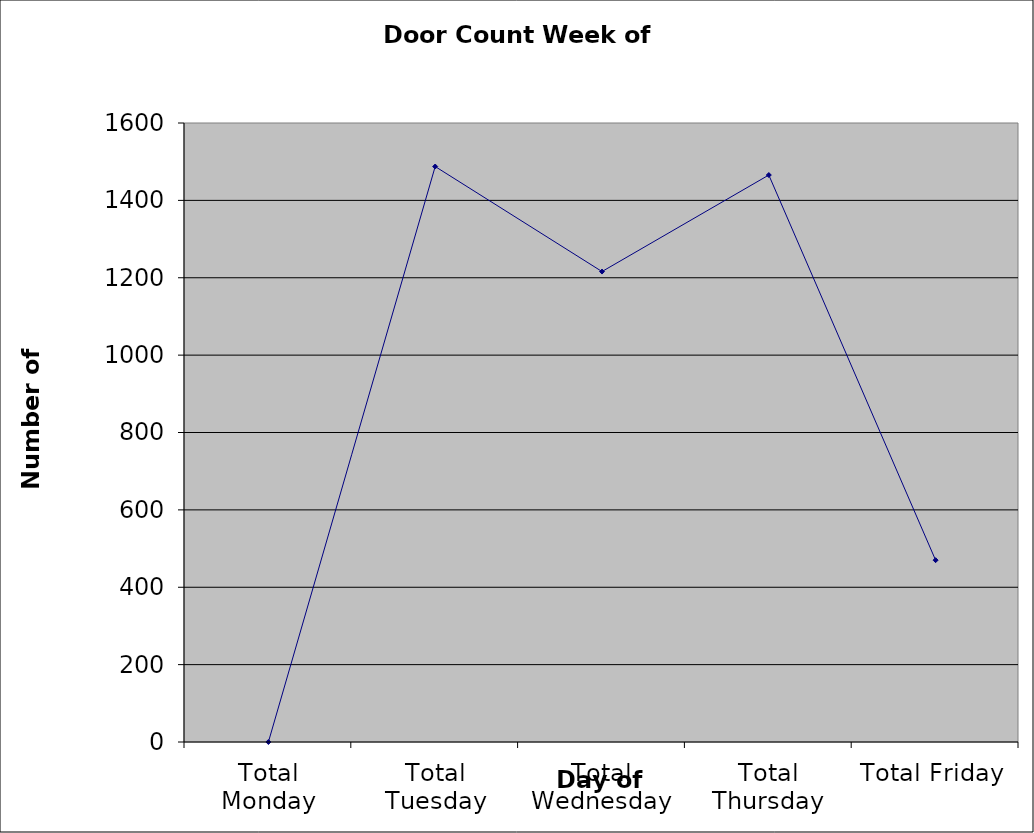
| Category | Series 0 |
|---|---|
| Total Monday | 0 |
| Total Tuesday | 1487.5 |
| Total Wednesday | 1216 |
| Total Thursday | 1465.5 |
| Total Friday | 470 |